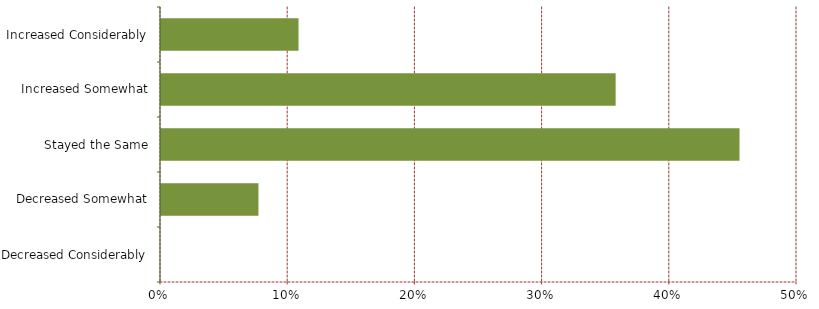
| Category | Series 0 |
|---|---|
| Decreased Considerably | 0 |
| Decreased Somewhat | 0.077 |
| Stayed the Same | 0.456 |
| Increased Somewhat | 0.358 |
| Increased Considerably | 0.109 |